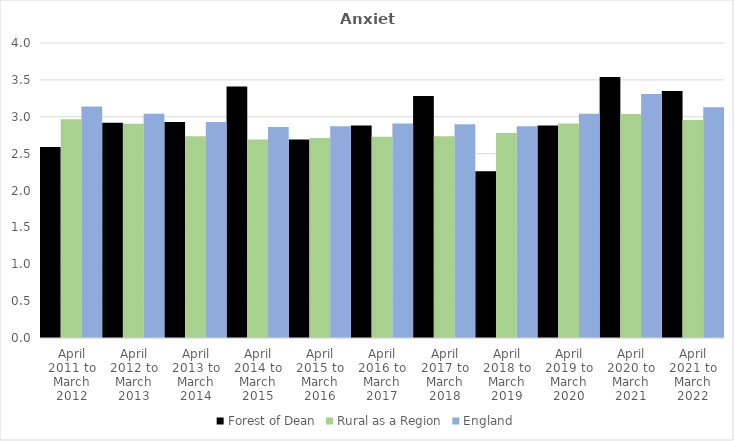
| Category | Forest of Dean | Rural as a Region | England |
|---|---|---|---|
| April 2011 to March 2012 | 2.59 | 2.967 | 3.14 |
| April 2012 to March 2013 | 2.92 | 2.904 | 3.04 |
| April 2013 to March 2014 | 2.93 | 2.734 | 2.93 |
| April 2014 to March 2015 | 3.41 | 2.691 | 2.86 |
| April 2015 to March 2016 | 2.69 | 2.711 | 2.87 |
| April 2016 to March 2017 | 2.88 | 2.729 | 2.91 |
| April 2017 to March 2018 | 3.28 | 2.736 | 2.9 |
| April 2018 to March 2019 | 2.26 | 2.78 | 2.87 |
| April 2019 to March 2020 | 2.88 | 2.908 | 3.04 |
| April 2020 to March 2021 | 3.54 | 3.036 | 3.31 |
| April 2021 to March 2022 | 3.35 | 2.956 | 3.13 |